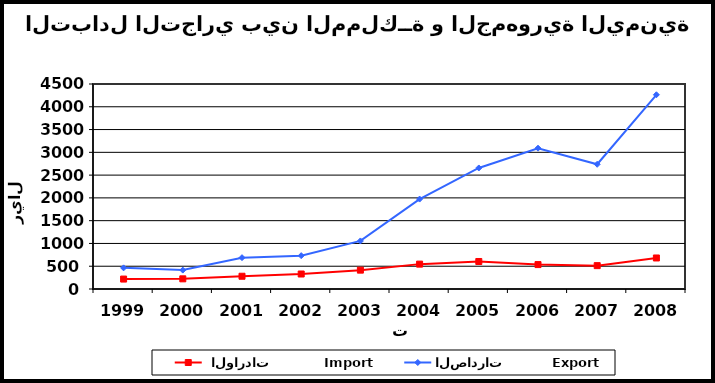
| Category |  الواردات           Import | الصادرات          Export |
|---|---|---|
| 1999.0 | 218 | 464 |
| 2000.0 | 223 | 415 |
| 2001.0 | 280 | 688 |
| 2002.0 | 329 | 732 |
| 2003.0 | 414 | 1055 |
| 2004.0 | 546 | 1974 |
| 2005.0 | 604 | 2657 |
| 2006.0 | 536 | 3091 |
| 2007.0 | 513 | 2738 |
| 2008.0 | 681 | 4263 |